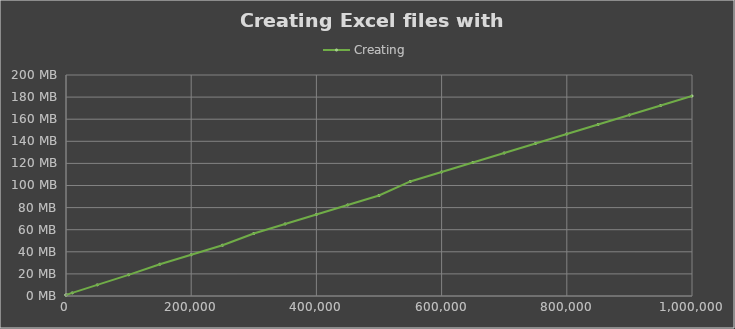
| Category | Creating |
|---|---|
| 1.0 | 0.94 |
| 10.0 | 0.941 |
| 100.0 | 0.957 |
| 1000.0 | 1.119 |
| 10000.0 | 2.785 |
| 50000.0 | 10.044 |
| 100000.0 | 19.15 |
| 150000.0 | 28.768 |
| 200000.0 | 37.361 |
| 250000.0 | 45.955 |
| 300000.0 | 56.597 |
| 350000.0 | 65.191 |
| 400000.0 | 73.784 |
| 450000.0 | 82.378 |
| 500000.0 | 90.972 |
| 550000.0 | 103.662 |
| 600000.0 | 112.255 |
| 650000.0 | 120.849 |
| 700000.0 | 129.443 |
| 750000.0 | 138.037 |
| 800000.0 | 146.63 |
| 850000.0 | 155.224 |
| 900000.0 | 163.818 |
| 950000.0 | 172.412 |
| 1000000.0 | 181.005 |